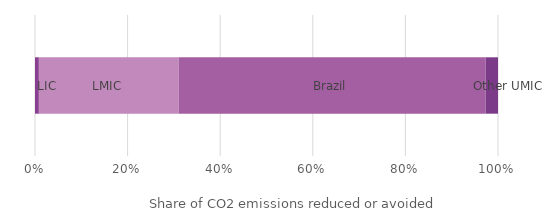
| Category | LIC | LMIC | Brazil | Other UMIC |
|---|---|---|---|---|
| Share of CO2 emissions reduced or avoided, 2017 | 622864 | 22460449.11 | 49352138 | 1992359.58 |